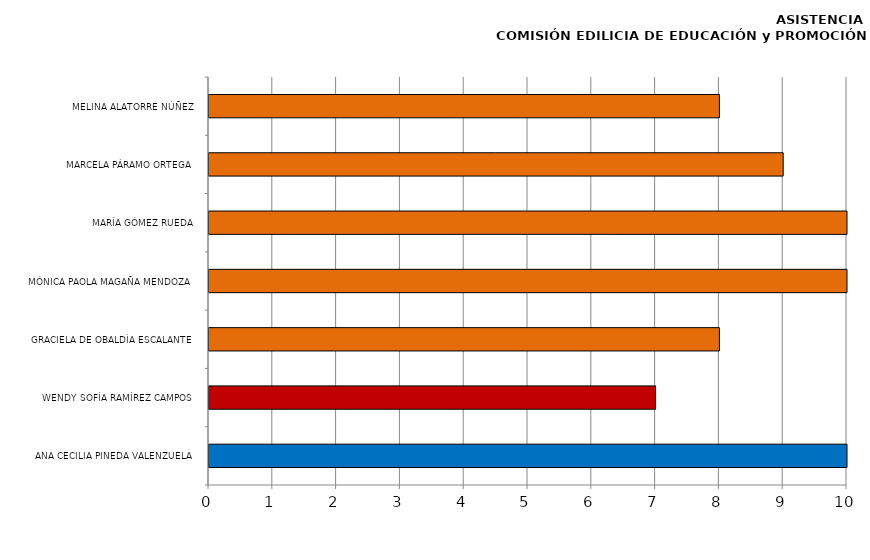
| Category | Series 0 |
|---|---|
| ANA CECILIA PINEDA VALENZUELA | 10 |
| WENDY SOFÍA RAMÍREZ CAMPOS | 7 |
| GRACIELA DE OBALDÍA ESCALANTE | 8 |
| MÓNICA PAOLA MAGAÑA MENDOZA | 10 |
| MARÍA GÓMEZ RUEDA | 10 |
| MARCELA PÁRAMO ORTEGA | 9 |
| MELINA ALATORRE NÚÑEZ | 8 |